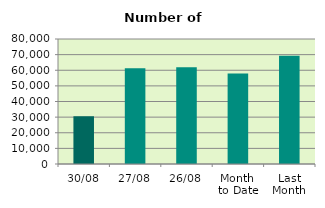
| Category | Series 0 |
|---|---|
| 30/08 | 30588 |
| 27/08 | 61304 |
| 26/08 | 61994 |
| Month 
to Date | 57920.667 |
| Last
Month | 69237.818 |